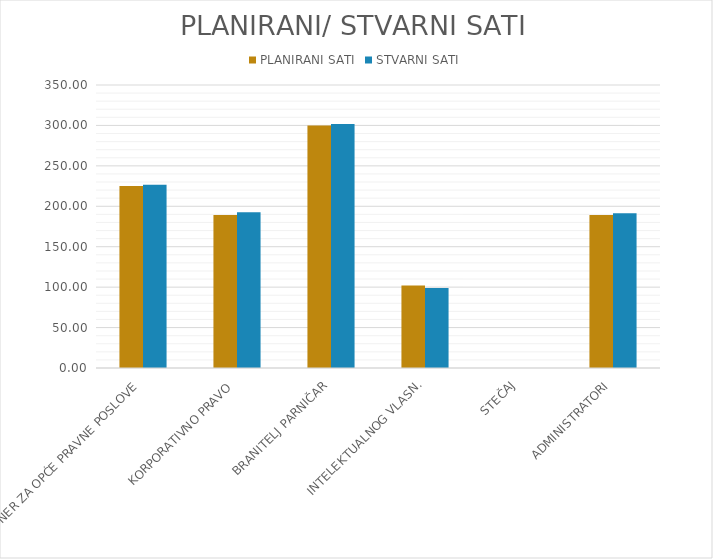
| Category | PLANIRANI SATI | STVARNI SATI |
|---|---|---|
| PARTNER ZA OPĆE PRAVNE POSLOVE | 225 | 226.5 |
| KORPORATIVNO PRAVO | 189.286 | 192.5 |
| BRANITELJ PARNIČAR | 300 | 301.714 |
| INTELEKTUALNOG VLASN. | 102.143 | 99 |
| STEČAJ | 0 | 0 |
| ADMINISTRATORI | 189.286 | 191.429 |